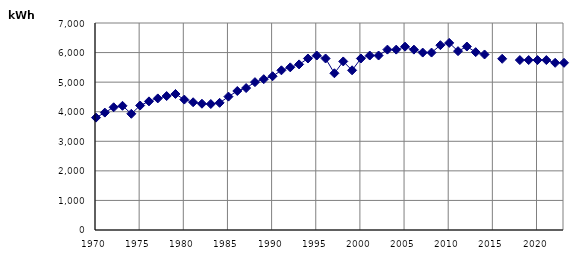
| Category | kWh |
|---|---|
| 1970.0 | 3800 |
| 1971.0 | 3970 |
| 1972.0 | 4150 |
| 1973.0 | 4200 |
| 1974.0 | 3930 |
| 1975.0 | 4210 |
| 1976.0 | 4350 |
| 1977.0 | 4450 |
| 1978.0 | 4530 |
| 1979.0 | 4600 |
| 1980.0 | 4410 |
| 1981.0 | 4320 |
| 1982.0 | 4270 |
| 1983.0 | 4260 |
| 1984.0 | 4300 |
| 1985.0 | 4510 |
| 1986.0 | 4700 |
| 1987.0 | 4800 |
| 1988.0 | 5000 |
| 1989.0 | 5100 |
| 1990.0 | 5200 |
| 1991.0 | 5400 |
| 1992.0 | 5500 |
| 1993.0 | 5600 |
| 1994.0 | 5800 |
| 1995.0 | 5900 |
| 1996.0 | 5800 |
| 1997.0 | 5300 |
| 1998.0 | 5700 |
| 1999.0 | 5400 |
| 2000.0 | 5800 |
| 2001.0 | 5900 |
| 2002.0 | 5900 |
| 2003.0 | 6100 |
| 2004.0 | 6100 |
| 2005.0 | 6200 |
| 2006.0 | 6100 |
| 2007.0 | 6000 |
| 2008.0 | 6000 |
| 2009.0 | 6249.909 |
| 2010.0 | 6326.873 |
| 2011.0 | 6047.482 |
| 2012.0 | 6204.612 |
| 2013.0 | 6014.448 |
| 2014.0 | 5935.345 |
| 2015.0 | 0 |
| 2016.0 | 5789.522 |
| 2017.0 | 0 |
| 2018.0 | 5746.621 |
| 2019.0 | 5746.621 |
| 2020.0 | 5746.621 |
| 2021.0 | 5746.621 |
| 2022.0 | 5654.122 |
| 2023.0 | 5654.122 |